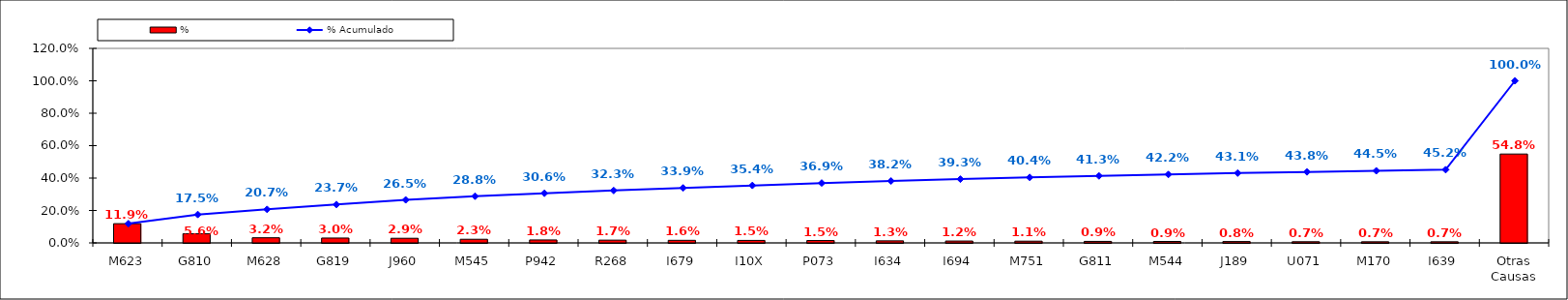
| Category | % |
|---|---|
| M623 | 0.119 |
| G810 | 0.056 |
| M628 | 0.032 |
| G819 | 0.03 |
| J960 | 0.029 |
| M545 | 0.023 |
| P942 | 0.018 |
| R268 | 0.017 |
| I679 | 0.016 |
| I10X | 0.015 |
| P073 | 0.015 |
| I634 | 0.013 |
| I694 | 0.012 |
| M751 | 0.011 |
| G811 | 0.009 |
| M544 | 0.009 |
| J189 | 0.008 |
| U071 | 0.007 |
| M170 | 0.007 |
| I639 | 0.007 |
| Otras Causas | 0.548 |